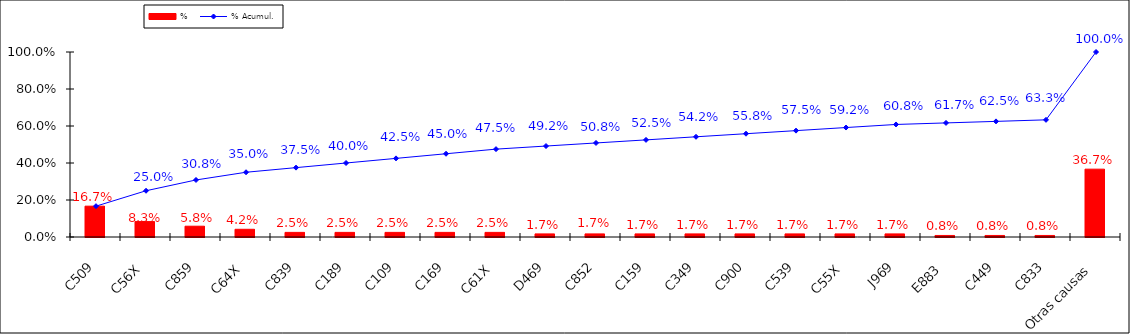
| Category | % |
|---|---|
| C509 | 0.167 |
| C56X | 0.083 |
| C859 | 0.058 |
| C64X | 0.042 |
| C839 | 0.025 |
| C189 | 0.025 |
| C109 | 0.025 |
| C169 | 0.025 |
| C61X | 0.025 |
| D469 | 0.017 |
| C852 | 0.017 |
| C159 | 0.017 |
| C349 | 0.017 |
| C900 | 0.017 |
| C539 | 0.017 |
| C55X | 0.017 |
| J969 | 0.017 |
| E883 | 0.008 |
| C449 | 0.008 |
| C833 | 0.008 |
| Otras causas | 0.367 |